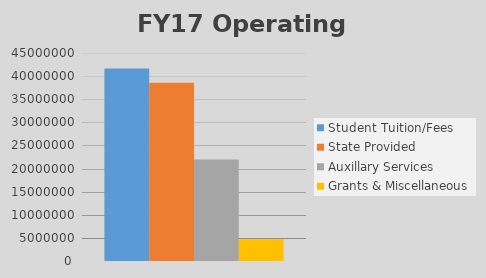
| Category | Student Tuition/Fees | State Provided | Auxillary Services | Grants & Miscellaneous |
|---|---|---|---|---|
| 0 | 41654660 | 38544000 | 21971743 | 4700054 |